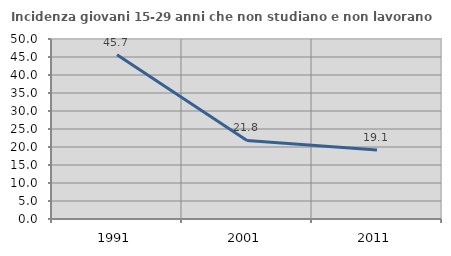
| Category | Incidenza giovani 15-29 anni che non studiano e non lavorano  |
|---|---|
| 1991.0 | 45.65 |
| 2001.0 | 21.814 |
| 2011.0 | 19.141 |